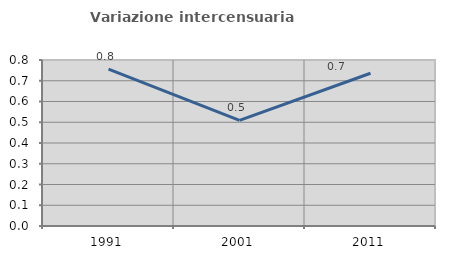
| Category | Variazione intercensuaria annua |
|---|---|
| 1991.0 | 0.756 |
| 2001.0 | 0.509 |
| 2011.0 | 0.736 |